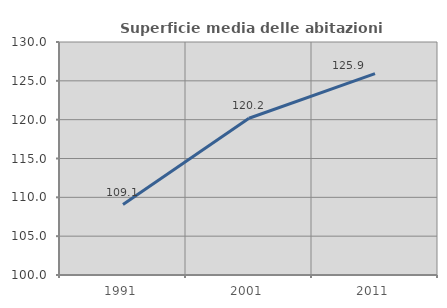
| Category | Superficie media delle abitazioni occupate |
|---|---|
| 1991.0 | 109.074 |
| 2001.0 | 120.18 |
| 2011.0 | 125.927 |